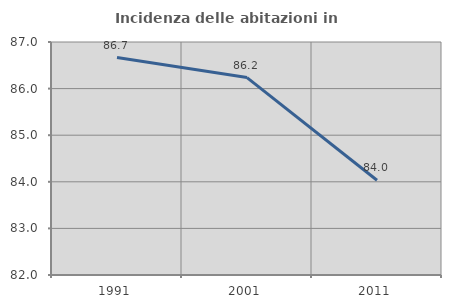
| Category | Incidenza delle abitazioni in proprietà  |
|---|---|
| 1991.0 | 86.667 |
| 2001.0 | 86.236 |
| 2011.0 | 84.034 |